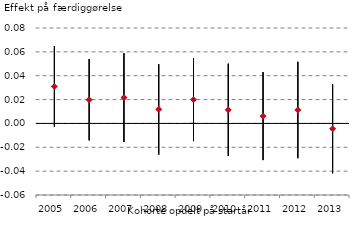
| Category | Serie 1 | Serie 2 | Serie 3 |
|---|---|---|---|
| 2005.0 | 0.065 | -0.003 | 0.031 |
| 2006.0 | 0.054 | -0.014 | 0.02 |
| 2007.0 | 0.059 | -0.016 | 0.022 |
| 2008.0 | 0.05 | -0.026 | 0.012 |
| 2009.0 | 0.055 | -0.015 | 0.02 |
| 2010.0 | 0.05 | -0.027 | 0.011 |
| 2011.0 | 0.043 | -0.031 | 0.006 |
| 2012.0 | 0.052 | -0.029 | 0.011 |
| 2013.0 | 0.033 | -0.042 | -0.004 |